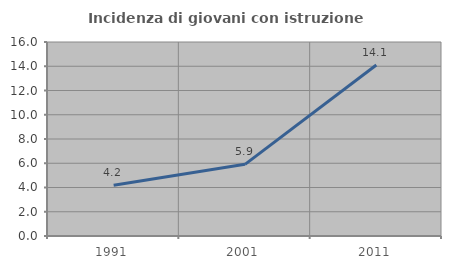
| Category | Incidenza di giovani con istruzione universitaria |
|---|---|
| 1991.0 | 4.188 |
| 2001.0 | 5.91 |
| 2011.0 | 14.103 |